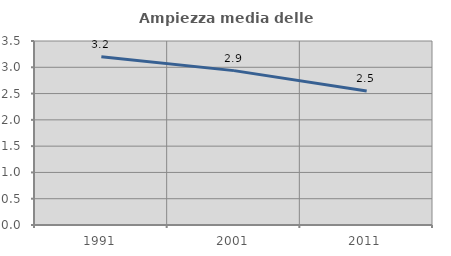
| Category | Ampiezza media delle famiglie |
|---|---|
| 1991.0 | 3.202 |
| 2001.0 | 2.936 |
| 2011.0 | 2.548 |